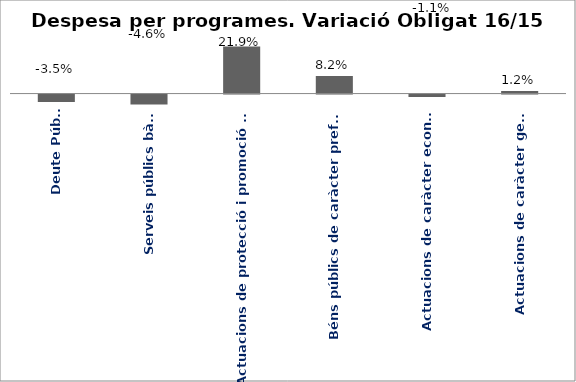
| Category | Series 0 |
|---|---|
| Deute Públic | -0.035 |
| Serveis públics bàsics | -0.046 |
| Actuacions de protecció i promoció social | 0.219 |
| Béns públics de caràcter preferent | 0.082 |
| Actuacions de caràcter econòmic | -0.011 |
| Actuacions de caràcter general | 0.012 |